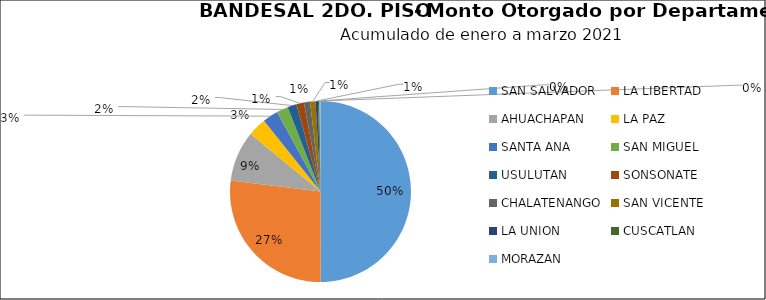
| Category | Monto | Créditos |
|---|---|---|
| SAN SALVADOR | 13.242 | 195 |
| LA LIBERTAD | 7.15 | 116 |
| AHUACHAPAN | 2.39 | 52 |
| LA PAZ | 0.875 | 60 |
| SANTA ANA | 0.734 | 54 |
| SAN MIGUEL | 0.547 | 61 |
| USULUTAN | 0.425 | 49 |
| SONSONATE | 0.359 | 45 |
| CHALATENANGO | 0.29 | 8 |
| SAN VICENTE | 0.261 | 20 |
| LA UNION | 0.111 | 18 |
| CUSCATLAN | 0.07 | 9 |
| MORAZAN | 0.049 | 24 |